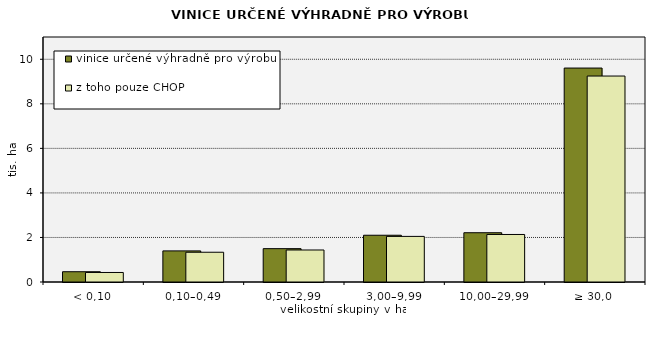
| Category | vinice určené výhradně pro výrobu vína | z toho pouze CHOP |
|---|---|---|
| < 0,10 | 461.553 | 427.838 |
| 0,10–0,49 | 1396.771 | 1336.376 |
| 0,50–2,99 | 1497.339 | 1437.142 |
| 3,00–9,99 | 2099.008 | 2047.448 |
| 10,00–29,99 | 2212.199 | 2133.706 |
| ≥ 30,0 | 9605.621 | 9247.53 |